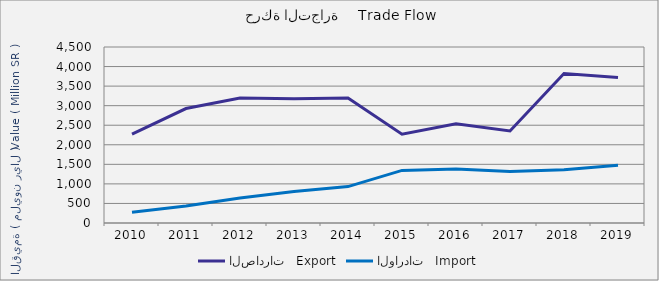
| Category | الصادرات   Export | الواردات   Import |
|---|---|---|
| 2010.0 | 2274421814 | 276696129 |
| 2011.0 | 2926490158 | 434939386 |
| 2012.0 | 3193451467 | 641185880 |
| 2013.0 | 3177421786 | 803959319 |
| 2014.0 | 3195602454 | 930592547 |
| 2015.0 | 2268420907 | 1345382797 |
| 2016.0 | 2538117712 | 1383215549 |
| 2017.0 | 2352787558 | 1314549456 |
| 2018.0 | 3823117267 | 1362636706 |
| 2019.0 | 3717465053 | 1478696930 |